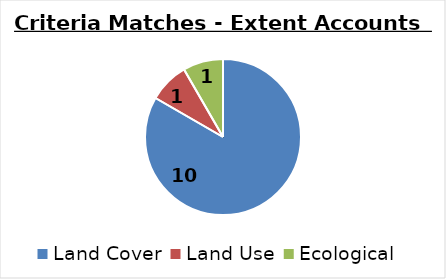
| Category | Matches |
|---|---|
| Land Cover  | 10 |
| Land Use  | 1 |
| Ecological  | 1 |